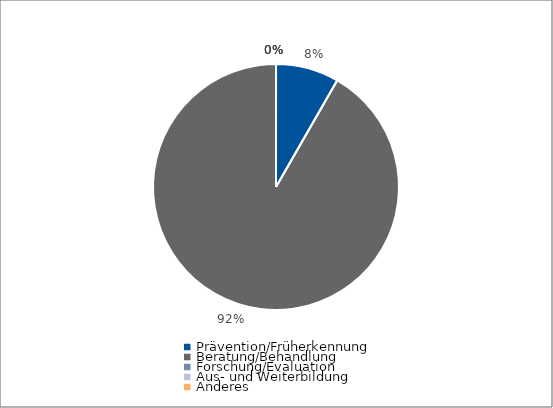
| Category | Series 0 |
|---|---|
| Prävention/Früherkennung | 5600 |
| Beratung/Behandlung | 61900 |
| Forschung/Evaluation | 0 |
| Aus- und Weiterbildung | 0 |
| Anderes | 0 |